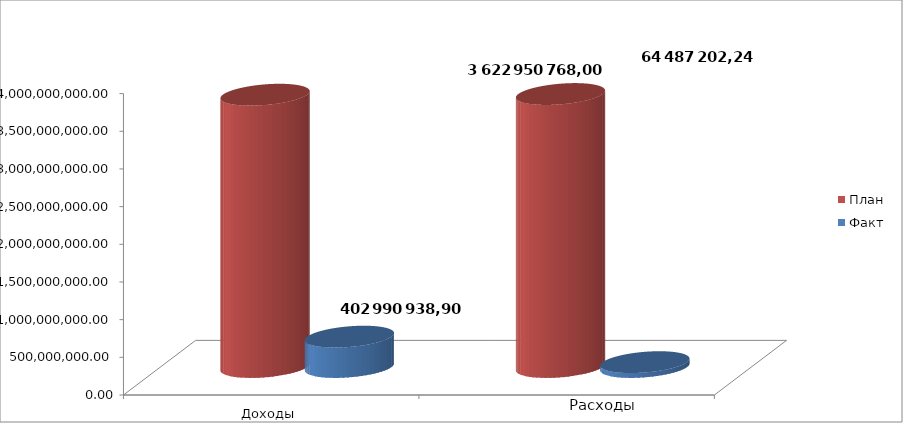
| Category | План | Факт |
|---|---|---|
| 0 | 3614085343 | 402990938.9 |
| 1 | 3622950768 | 64487202.24 |